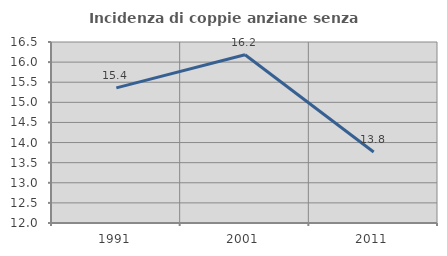
| Category | Incidenza di coppie anziane senza figli  |
|---|---|
| 1991.0 | 15.361 |
| 2001.0 | 16.181 |
| 2011.0 | 13.766 |